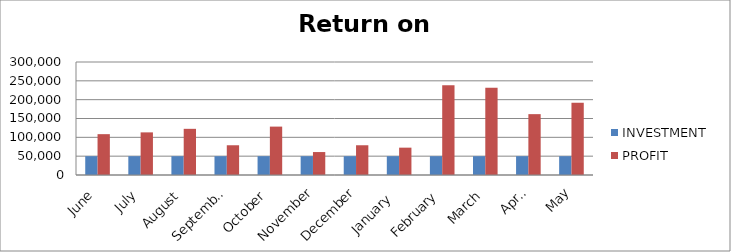
| Category | INVESTMENT  | PROFIT |
|---|---|---|
| June | 50000 | 108434 |
| July | 50000 | 113164 |
| August | 50000 | 122577 |
| September | 50000 | 78963 |
| October | 50000 | 128482 |
| November | 50000 | 60935 |
| December | 50000 | 78969 |
| January  | 50000 | 72595 |
| February | 50000 | 238492 |
| March | 50000 | 231870 |
| April | 50000 | 161565 |
| May | 50000 | 191852 |